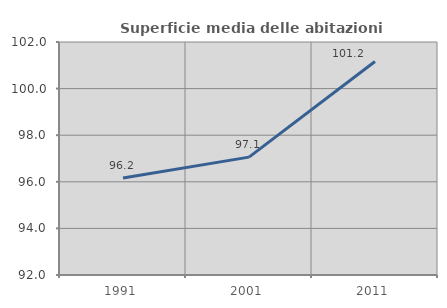
| Category | Superficie media delle abitazioni occupate |
|---|---|
| 1991.0 | 96.162 |
| 2001.0 | 97.059 |
| 2011.0 | 101.164 |